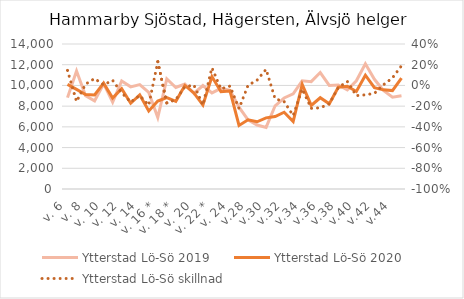
| Category | Ytterstad |
|---|---|
| v. 6 | 10104 |
| v. 7 | 9620 |
| v. 8 | 9120 |
| v. 9 | 9076 |
| v. 10 | 10224.5 |
| v. 11 | 8792 |
| v. 12 | 9691.5 |
| v. 13 | 8281 |
| v. 14 | 9090 |
| v. 15 * | 7540 |
| v. 16 * | 8486.888 |
| v. 17 | 8828.354 |
| v. 18 * | 8465.832 |
| v. 19 | 9998.361 |
| v. 20 | 9271.75 |
| v. 21 * | 8101.511 |
| v. 22 * | 10853.086 |
| v. 23 | 9389.877 |
| v. 24 | 9471.268 |
| v.27 | 6132.509 |
| v.28 | 6687.276 |
| v.29 | 6491.428 |
| v.30 | 6868.049 |
| v.31 | 6998.446 |
| v.32 | 7414.752 |
| v.33 | 6514.452 |
| v.34 | 10090.929 |
| v.35 | 8068.586 |
| v.36 | 8810.5 |
| v.37 | 8221.28 |
| v.38 | 9832.5 |
| v.39 | 9923.056 |
| v.40 | 9417.844 |
| v.41 | 10987.011 |
| v.42 | 9781.361 |
| v.43 | 9571.202 |
| v.44 | 9503.749 |
| v.45 | 10697.838 |